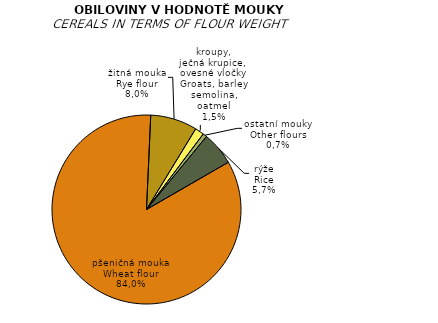
| Category | 2015 |
|---|---|
| pšeničná mouka | 95.22 |
| žitná mouka | 9.06 |
| kroupy,
ječná krupice, 
ovesné vločky | 1.75 |
| ostatní mouky | 0.78 |
| rýže | 6.48 |